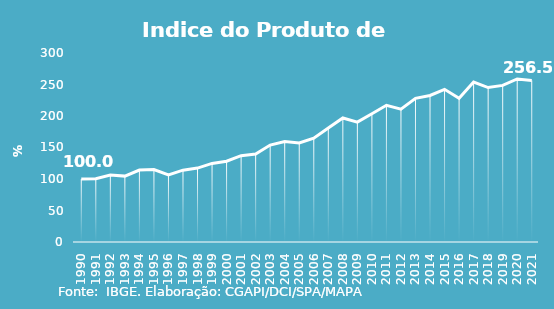
| Category | Indice de Prod. base 1990 |
|---|---|
| 1990.0 | 100 |
| 1991.0 | 100.275 |
| 1992.0 | 106.203 |
| 1993.0 | 104.57 |
| 1994.0 | 114.164 |
| 1995.0 | 115.024 |
| 1996.0 | 106.552 |
| 1997.0 | 114.037 |
| 1998.0 | 117.319 |
| 1999.0 | 124.734 |
| 2000.0 | 128.293 |
| 2001.0 | 136.975 |
| 2002.0 | 139.51 |
| 2003.0 | 153.868 |
| 2004.0 | 159.641 |
| 2005.0 | 157.136 |
| 2006.0 | 164.858 |
| 2007.0 | 180.781 |
| 2008.0 | 196.91 |
| 2009.0 | 190.309 |
| 2010.0 | 203.581 |
| 2011.0 | 217.041 |
| 2012.0 | 210.932 |
| 2013.0 | 228.009 |
| 2014.0 | 232.562 |
| 2015.0 | 242.318 |
| 2016.0 | 228.239 |
| 2017.0 | 253.826 |
| 2018.0 | 245.134 |
| 2019.0 | 248.619 |
| 2020.0 | 258.848 |
| 2021.0 | 256.527 |